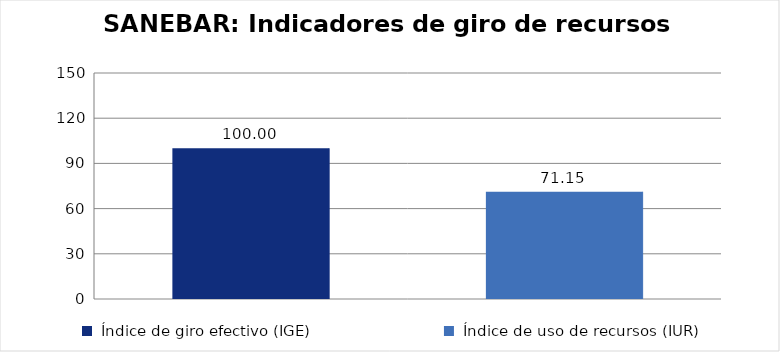
| Category | Total Programa |
|---|---|
| Índice de giro efectivo (IGE) | 100 |
| Índice de uso de recursos (IUR)  | 71.148 |